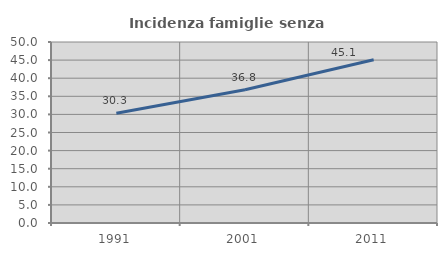
| Category | Incidenza famiglie senza nuclei |
|---|---|
| 1991.0 | 30.33 |
| 2001.0 | 36.832 |
| 2011.0 | 45.12 |